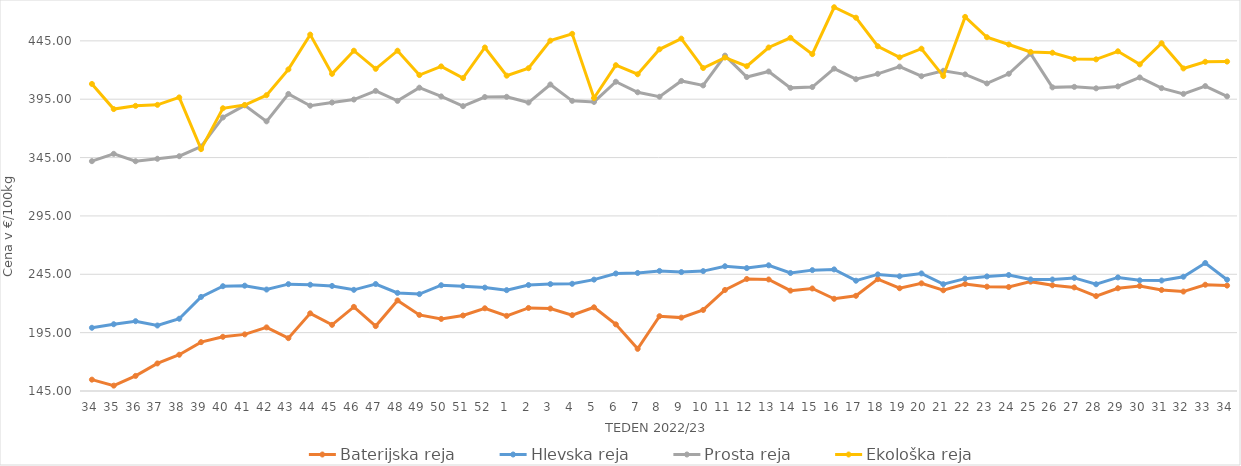
| Category | Baterijska reja | Hlevska reja | Prosta reja | Ekološka reja |
|---|---|---|---|---|
| 34.0 | 154.73 | 199.17 | 341.92 | 408.1 |
| 35.0 | 149.6 | 202.21 | 348.2 | 386.55 |
| 36.0 | 157.93 | 204.81 | 341.85 | 389.31 |
| 37.0 | 168.61 | 201.11 | 343.97 | 390.17 |
| 38.0 | 176.07 | 206.91 | 346.16 | 396.55 |
| 39.0 | 186.86 | 225.6 | 354.41 | 352.24 |
| 40.0 | 191.45 | 234.79 | 379.35 | 387.24 |
| 41.0 | 193.52 | 235.24 | 389.75 | 390 |
| 42.0 | 199.51 | 231.92 | 376.02 | 398.45 |
| 43.0 | 190.28 | 236.56 | 399.51 | 420.52 |
| 44.0 | 211.53 | 236.04 | 389.44 | 450.35 |
| 45.0 | 201.69 | 235.01 | 392.15 | 416.72 |
| 46.0 | 217.08 | 231.68 | 394.71 | 436.55 |
| 47.0 | 200.62 | 236.65 | 402.12 | 421.03 |
| 48.0 | 222.61 | 229.05 | 393.56 | 436.55 |
| 49.0 | 210.16 | 228.03 | 404.87 | 415.69 |
| 50.0 | 206.76 | 235.63 | 397.4 | 423.1 |
| 51.0 | 209.69 | 234.79 | 389.05 | 413.1 |
| 52.0 | 215.87 | 233.58 | 396.87 | 439.31 |
| 1.0 | 209.37 | 231.41 | 397.04 | 415.17 |
| 2.0 | 216.15 | 235.78 | 392.13 | 421.55 |
| 3.0 | 215.63 | 236.58 | 407.61 | 445.17 |
| 4.0 | 210 | 236.85 | 393.58 | 451.04 |
| 5.0 | 216.7 | 240.42 | 392.67 | 396.03 |
| 6.0 | 202.1 | 245.67 | 409.97 | 424.14 |
| 7.0 | 181.11 | 246.12 | 400.94 | 416.38 |
| 8.0 | 209.08 | 247.88 | 397.11 | 437.76 |
| 9.0 | 207.87 | 246.89 | 410.64 | 446.9 |
| 10.0 | 214.42 | 247.73 | 406.8 | 421.72 |
| 11.0 | 231.56 | 251.88 | 432.34 | 430.69 |
| 12.0 | 240.97 | 250.3 | 414 | 423.28 |
| 13.0 | 240.55 | 252.7 | 418.74 | 439.31 |
| 14.0 | 230.99 | 246.12 | 404.72 | 447.59 |
| 15.0 | 232.82 | 248.56 | 405.42 | 433.62 |
| 16.0 | 224 | 249.17 | 421.22 | 473.79 |
| 17.0 | 226.57 | 239.5 | 412.13 | 464.83 |
| 18.0 | 240.83 | 244.89 | 416.74 | 440.35 |
| 19.0 | 233.05 | 243.26 | 422.93 | 430.86 |
| 20.0 | 237.25 | 245.73 | 414.68 | 438.28 |
| 21.0 | 231.3 | 236.5 | 419.36 | 414.83 |
| 22.0 | 236.67 | 241.27 | 416.27 | 465.52 |
| 23.0 | 234.39 | 243.16 | 408.53 | 448.1 |
| 24.0 | 234.08 | 244.37 | 416.78 | 441.9 |
| 25.0 | 238.69 | 240.6 | 434.05 | 435.52 |
| 26.0 | 235.57 | 240.51 | 405.15 | 434.83 |
| 27.0 | 233.75 | 241.89 | 405.58 | 429.48 |
| 28.0 | 226.35 | 236.46 | 404.32 | 429.14 |
| 29.0 | 233.03 | 242.31 | 405.96 | 436.04 |
| 30.0 | 235 | 239.8 | 413.63 | 424.83 |
| 31.0 | 231.55 | 239.67 | 404.46 | 442.93 |
| 32.0 | 230.2 | 242.89 | 399.57 | 421.38 |
| 33.0 | 236.04 | 254.68 | 406.23 | 427.07 |
| 34.0 | 235.32 | 240.35 | 397.45 | 427.24 |